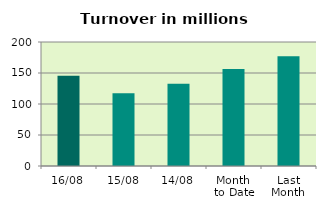
| Category | Series 0 |
|---|---|
| 16/08 | 145.751 |
| 15/08 | 117.15 |
| 14/08 | 132.678 |
| Month 
to Date | 156.443 |
| Last
Month | 177.022 |